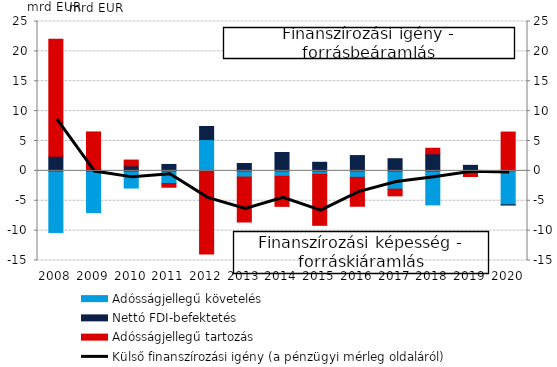
| Category | Adósságjellegű követelés | Nettó FDI-befektetés | Adósságjellegű tartozás |
|---|---|---|---|
| 2008.0 | -10.309 | 2.445 | 19.587 |
| 2009.0 | -6.97 | 0.259 | 6.258 |
| 2010.0 | -2.87 | 0.835 | 0.976 |
| 2011.0 | -2.116 | 1.076 | -0.621 |
| 2012.0 | 5.24 | 2.183 | -13.932 |
| 2013.0 | -1.033 | 1.232 | -7.528 |
| 2014.0 | -0.901 | 3.078 | -5.035 |
| 2015.0 | -0.567 | 1.438 | -8.546 |
| 2016.0 | -1.078 | 2.563 | -4.841 |
| 2017.0 | -3.061 | 2.037 | -1.118 |
| 2018.0 | -5.69 | 2.858 | 0.927 |
| 2019.0 | -0.389 | 0.926 | -0.548 |
| 2020.0 | -5.671 | -0.034 | 6.496 |